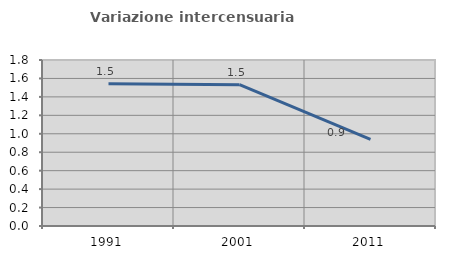
| Category | Variazione intercensuaria annua |
|---|---|
| 1991.0 | 1.542 |
| 2001.0 | 1.532 |
| 2011.0 | 0.94 |